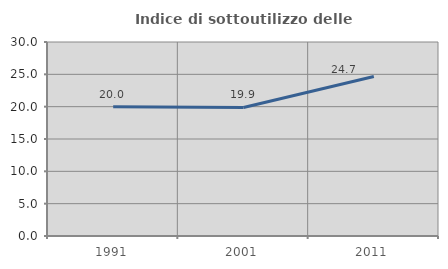
| Category | Indice di sottoutilizzo delle abitazioni  |
|---|---|
| 1991.0 | 20 |
| 2001.0 | 19.88 |
| 2011.0 | 24.67 |